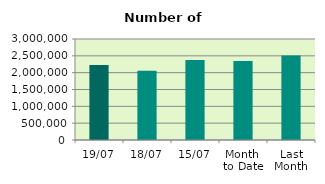
| Category | Series 0 |
|---|---|
| 19/07 | 2225626 |
| 18/07 | 2056428 |
| 15/07 | 2374626 |
| Month 
to Date | 2344760.154 |
| Last
Month | 2507488.545 |